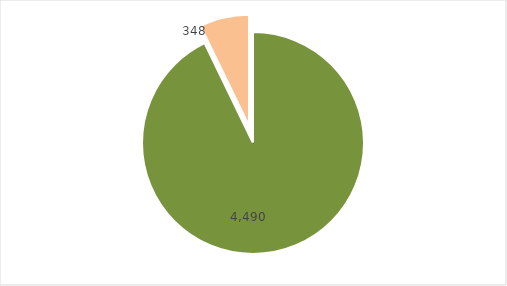
| Category | Series 0 |
|---|---|
| Ordinario  | 4490 |
| NNA | 348 |